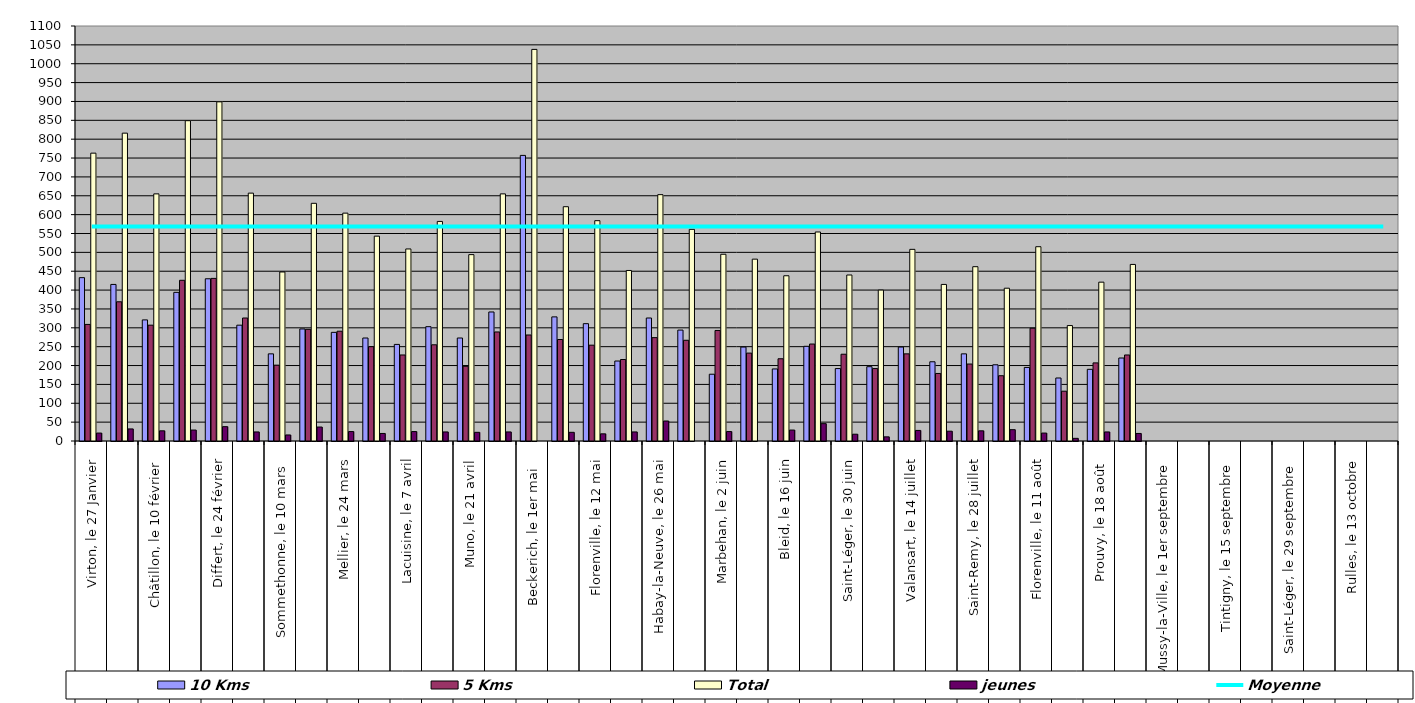
| Category | 10 Kms | 5 Kms | Total | jeunes |
|---|---|---|---|---|
| 0 | 433 | 309 | 763 | 21 |
| 1 | 415 | 369 | 816 | 32 |
| 2 | 321 | 307 | 655 | 27 |
| 3 | 394 | 426 | 849 | 29 |
| 4 | 430 | 431 | 899 | 38 |
| 5 | 307 | 326 | 657 | 24 |
| 6 | 231 | 201 | 448 | 16 |
| 7 | 297 | 296 | 630 | 37 |
| 8 | 288 | 291 | 604 | 25 |
| 9 | 273 | 250 | 543 | 20 |
| 10 | 256 | 228 | 509 | 25 |
| 11 | 303 | 255 | 582 | 24 |
| 12 | 273 | 198 | 494 | 23 |
| 13 | 342 | 289 | 655 | 24 |
| 14 | 757 | 281 | 1038 | 0 |
| 15 | 329 | 269 | 621 | 23 |
| 16 | 311 | 254 | 584 | 19 |
| 17 | 212 | 216 | 452 | 24 |
| 18 | 326 | 274 | 653 | 53 |
| 19 | 294 | 267 | 561 | 0 |
| 20 | 177 | 293 | 495 | 25 |
| 21 | 249 | 233 | 482 | 0 |
| 22 | 191 | 218 | 438 | 29 |
| 23 | 251 | 257 | 554 | 46 |
| 24 | 192 | 230 | 440 | 18 |
| 25 | 197 | 192 | 400 | 11 |
| 26 | 249 | 231 | 508 | 28 |
| 27 | 210 | 179 | 415 | 26 |
| 28 | 231 | 204 | 462 | 27 |
| 29 | 202 | 173 | 405 | 30 |
| 30 | 195 | 299 | 515 | 21 |
| 31 | 167 | 132 | 306 | 7 |
| 32 | 190 | 207 | 421 | 24 |
| 33 | 220 | 228 | 468 | 20 |
| 34 | 0 | 0 | 0 | 0 |
| 35 | 0 | 0 | 0 | 0 |
| 36 | 0 | 0 | 0 | 0 |
| 37 | 0 | 0 | 0 | 0 |
| 38 | 0 | 0 | 0 | 0 |
| 39 | 0 | 0 | 0 | 0 |
| 40 | 0 | 0 | 0 | 0 |
| 41 | 0 | 0 | 0 | 0 |